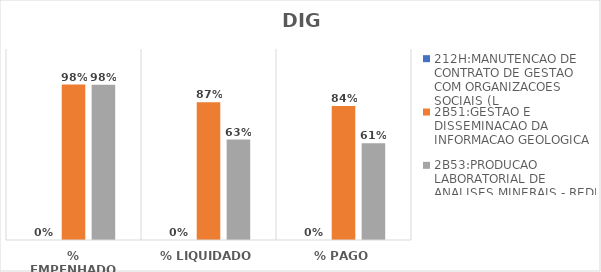
| Category | 212H:MANUTENCAO DE CONTRATO DE GESTAO COM ORGANIZACOES SOCIAIS (L | 2B51:GESTAO E DISSEMINACAO DA INFORMACAO GEOLOGICA | 2B53:PRODUCAO LABORATORIAL DE ANALISES MINERAIS - REDE LAMIN |
|---|---|---|---|
| % EMPENHADO | 0 | 0.977 | 0.975 |
| % LIQUIDADO | 0 | 0.866 | 0.631 |
| % PAGO | 0 | 0.842 | 0.608 |